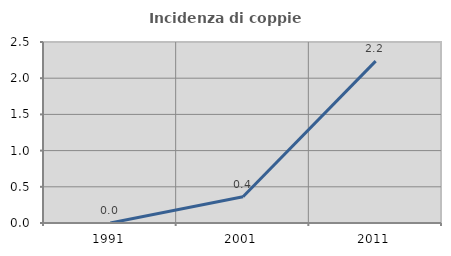
| Category | Incidenza di coppie miste |
|---|---|
| 1991.0 | 0 |
| 2001.0 | 0.363 |
| 2011.0 | 2.236 |